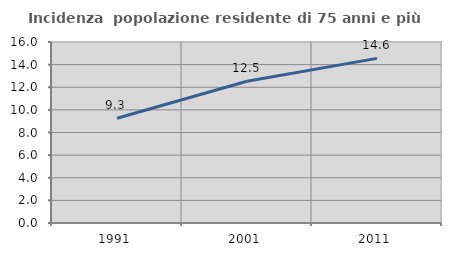
| Category | Incidenza  popolazione residente di 75 anni e più |
|---|---|
| 1991.0 | 9.26 |
| 2001.0 | 12.526 |
| 2011.0 | 14.551 |